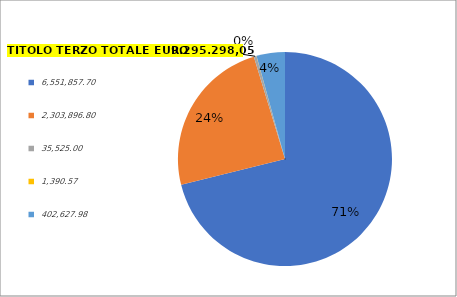
| Category | Series 1 | Series 2 | Series 0 |
|---|---|---|---|
| 6551857.7 | 6410776.45 | 5570359 | 5570359 |
| 2303896.8 | 2177691.36 | 4965059.36 | 4965059.36 |
| 35525.0 | 35525 | 35525 | 35525 |
| 1390.57 | 1390.57 | 1390.57 | 1390.57 |
| 402627.98 | 386852.3 | 349023.3 | 349023.3 |